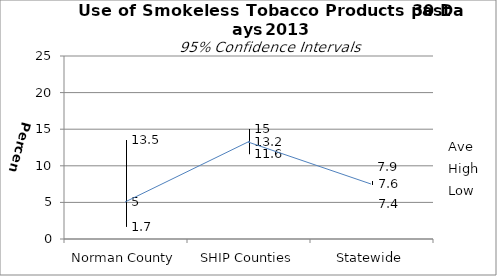
| Category | Ave | High | Low |
|---|---|---|---|
| Norman County | 5 | 13.5 | 1.7 |
| SHIP Counties | 13.2 | 15 | 11.6 |
| Statewide | 7.6 | 7.9 | 7.4 |